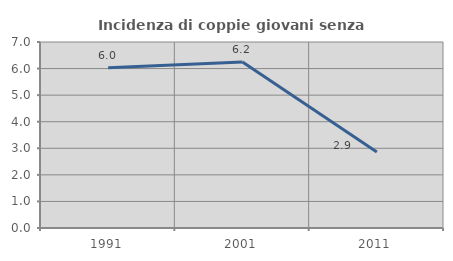
| Category | Incidenza di coppie giovani senza figli |
|---|---|
| 1991.0 | 6.034 |
| 2001.0 | 6.247 |
| 2011.0 | 2.857 |